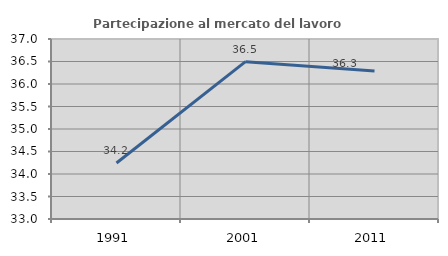
| Category | Partecipazione al mercato del lavoro  femminile |
|---|---|
| 1991.0 | 34.245 |
| 2001.0 | 36.496 |
| 2011.0 | 36.291 |